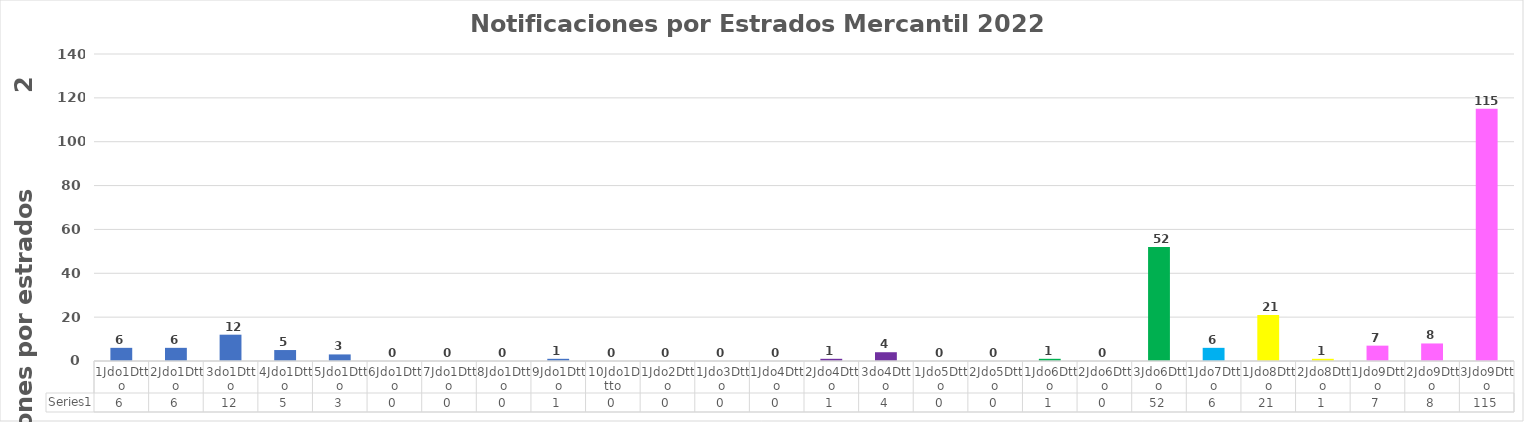
| Category | Series 0 |
|---|---|
| 1Jdo1Dtto | 6 |
| 2Jdo1Dtto | 6 |
| 3do1Dtto | 12 |
| 4Jdo1Dtto | 5 |
| 5Jdo1Dtto | 3 |
| 6Jdo1Dtto | 0 |
| 7Jdo1Dtto | 0 |
| 8Jdo1Dtto | 0 |
| 9Jdo1Dtto | 1 |
| 10Jdo1Dtto | 0 |
| 1Jdo2Dtto | 0 |
| 1Jdo3Dtto | 0 |
| 1Jdo4Dtto | 0 |
| 2Jdo4Dtto | 1 |
| 3do4Dtto | 4 |
| 1Jdo5Dtto | 0 |
| 2Jdo5Dtto | 0 |
| 1Jdo6Dtto | 1 |
| 2Jdo6Dtto | 0 |
| 3Jdo6Dtto | 52 |
| 1Jdo7Dtto | 6 |
| 1Jdo8Dtto | 21 |
| 2Jdo8Dtto | 1 |
| 1Jdo9Dtto | 7 |
| 2Jdo9Dtto | 8 |
| 3Jdo9Dtto | 115 |